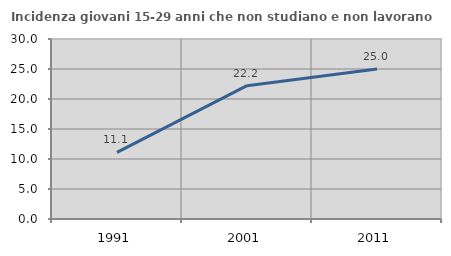
| Category | Incidenza giovani 15-29 anni che non studiano e non lavorano  |
|---|---|
| 1991.0 | 11.111 |
| 2001.0 | 22.222 |
| 2011.0 | 25 |